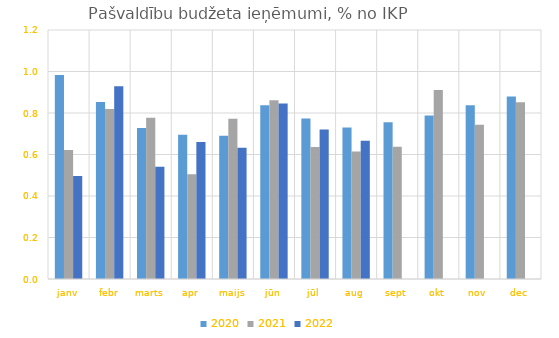
| Category | 2020 | 2021 | 2022 |
|---|---|---|---|
| janv | 0.983 | 0.622 | 0.496 |
| febr | 0.853 | 0.819 | 0.928 |
| marts | 0.727 | 0.777 | 0.541 |
| apr | 0.695 | 0.505 | 0.66 |
| maijs | 0.69 | 0.772 | 0.633 |
| jūn | 0.838 | 0.861 | 0.846 |
| jūl | 0.773 | 0.636 | 0.721 |
| aug | 0.73 | 0.614 | 0.667 |
| sept | 0.756 | 0.638 | 0 |
| okt | 0.788 | 0.911 | 0 |
| nov | 0.838 | 0.743 | 0 |
| dec | 0.88 | 0.851 | 0 |